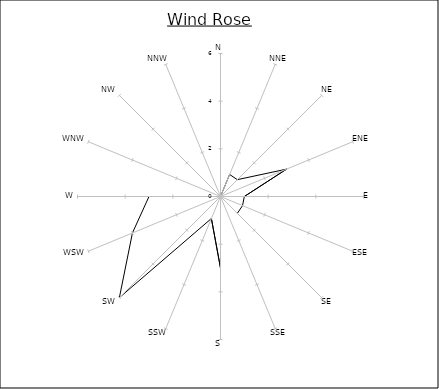
| Category | Series 0 |
|---|---|
| N | 0 |
| NNE | 1 |
| NE | 1 |
| ENE | 3 |
| E | 1 |
| ESE | 1 |
| SE | 1 |
| SSE | 0 |
| S | 3 |
| SSW | 1 |
| SW | 6 |
| WSW | 4 |
| W | 3 |
| WNW | 0 |
| NW | 2 |
| NNW | 0 |